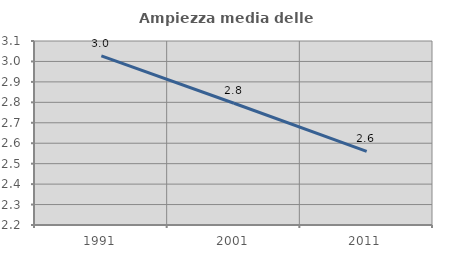
| Category | Ampiezza media delle famiglie |
|---|---|
| 1991.0 | 3.027 |
| 2001.0 | 2.796 |
| 2011.0 | 2.56 |